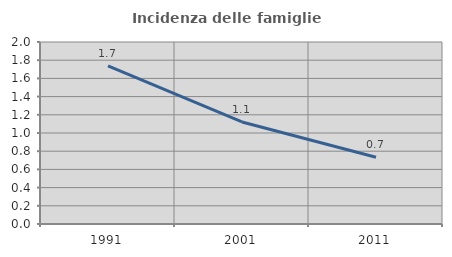
| Category | Incidenza delle famiglie numerose |
|---|---|
| 1991.0 | 1.737 |
| 2001.0 | 1.121 |
| 2011.0 | 0.734 |